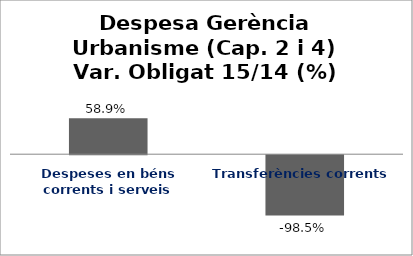
| Category | Series 0 |
|---|---|
| Despeses en béns corrents i serveis | 0.589 |
| Transferències corrents | -0.985 |